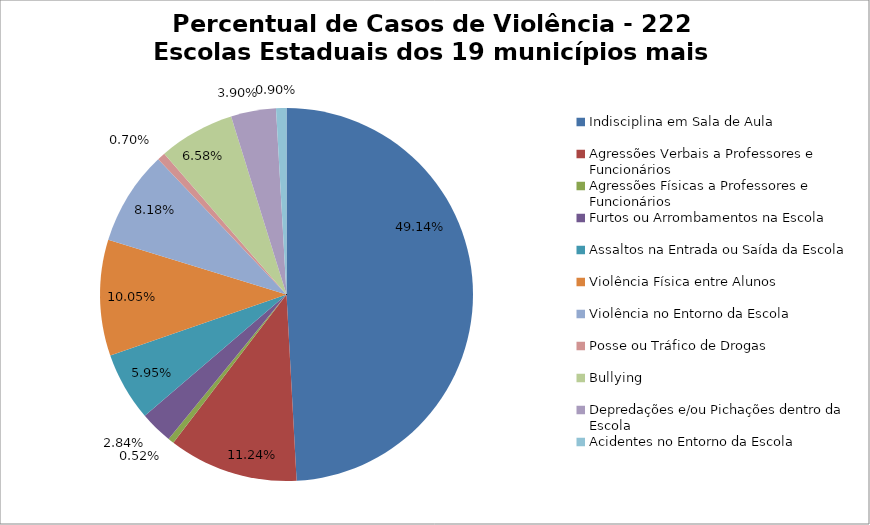
| Category | Percentual |
|---|---|
| Indisciplina em Sala de Aula | 0.491 |
| Agressões Verbais a Professores e Funcionários | 0.112 |
| Agressões Físicas a Professores e Funcionários | 0.005 |
| Furtos ou Arrombamentos na Escola | 0.028 |
| Assaltos na Entrada ou Saída da Escola | 0.06 |
| Violência Física entre Alunos | 0.101 |
| Violência no Entorno da Escola | 0.082 |
| Posse ou Tráfico de Drogas | 0.007 |
| Bullying | 0.066 |
| Depredações e/ou Pichações dentro da Escola | 0.039 |
| Acidentes no Entorno da Escola | 0.009 |